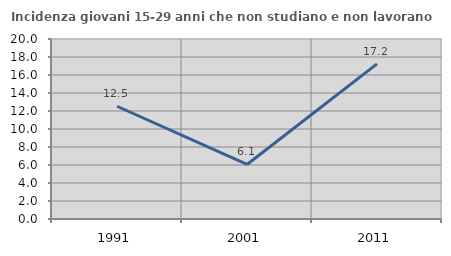
| Category | Incidenza giovani 15-29 anni che non studiano e non lavorano  |
|---|---|
| 1991.0 | 12.528 |
| 2001.0 | 6.061 |
| 2011.0 | 17.241 |